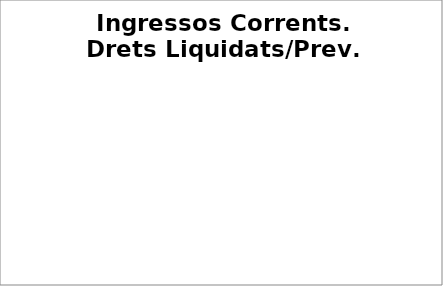
| Category | Series 0 |
|---|---|
| Impostos locals | 0.372 |
| Participació Tributs de l'Estat | 0.407 |
| Taxes i altres ingressos | 0.323 |
| Transferències corrents (exc. FCF) | 0.464 |
| Ingressos patrimonials | 0.168 |
| Ingressos corrents | 0.38 |